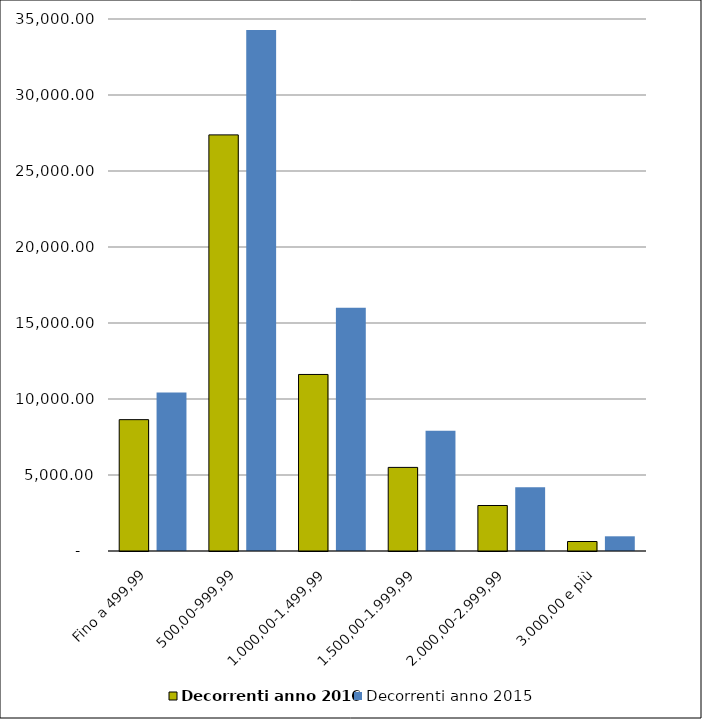
| Category | Decorrenti anno 2016 | Decorrenti anno 2015 |
|---|---|---|
| Fino a 499,99 | 8642 | 10432 |
| 500,00-999,99 | 27376 | 34279 |
| 1.000,00-1.499,99 | 11614 | 16007 |
| 1.500,00-1.999,99 | 5500 | 7915 |
| 2.000,00-2.999,99 | 2993 | 4192 |
| 3.000,00 e più | 624 | 967 |